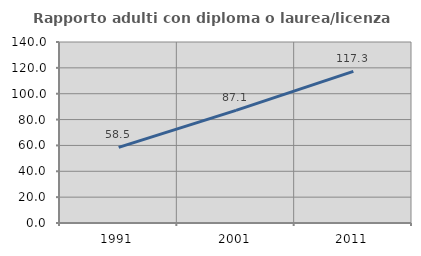
| Category | Rapporto adulti con diploma o laurea/licenza media  |
|---|---|
| 1991.0 | 58.491 |
| 2001.0 | 87.069 |
| 2011.0 | 117.308 |